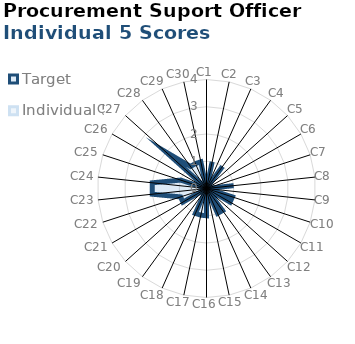
| Category | Target | Individual 5 |
|---|---|---|
| C1 | 0 | 0 |
| C2 | 1 | 0 |
| C3 | 0 | 0 |
| C4 | 1 | 0 |
| C5 | 0 | 0 |
| C6 | 0 | 0 |
| C7 | 0 | 0 |
| C8 | 1 | 0 |
| C9 | 0 | 0 |
| C10 | 1 | 0 |
| C11 | 1 | 0 |
| C12 | 0 | 0 |
| C13 | 1 | 0 |
| C14 | 1 | 0 |
| C15 | 0 | 0 |
| C16 | 1 | 0 |
| C17 | 1 | 0 |
| C18 | 1 | 0 |
| C19 | 0 | 0 |
| C20 | 0 | 0 |
| C21 | 1 | 0 |
| C22 | 1 | 0 |
| C23 | 2 | 0 |
| C24 | 2 | 0 |
| C25 | 1 | 0 |
| C26 | 0 | 0 |
| C27 | 2 | 0 |
| C28 | 1 | 0 |
| C29 | 1 | 0 |
| C30 | 1 | 0 |